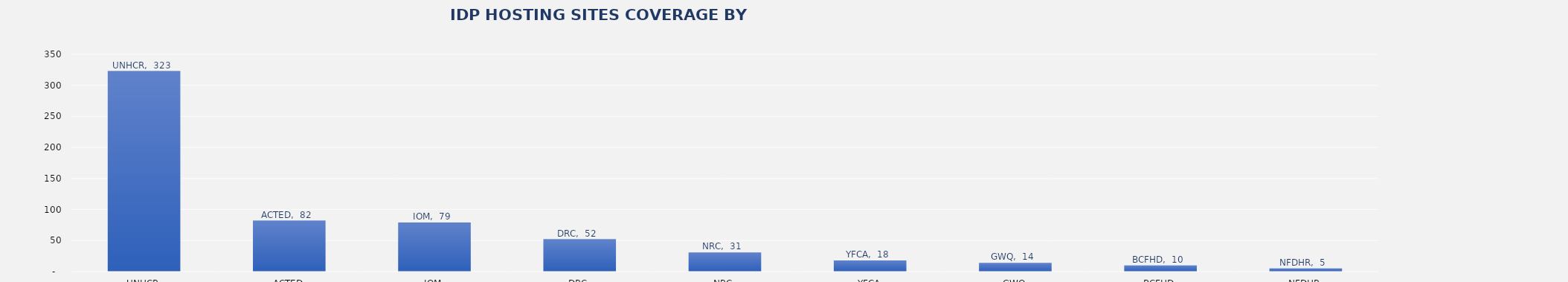
| Category | Total |
|---|---|
| UNHCR | 323 |
| ACTED | 82 |
| IOM | 79 |
| DRC | 52 |
| NRC | 31 |
| YFCA | 18 |
| GWQ | 14 |
| BCFHD | 10 |
| NFDHR | 5 |